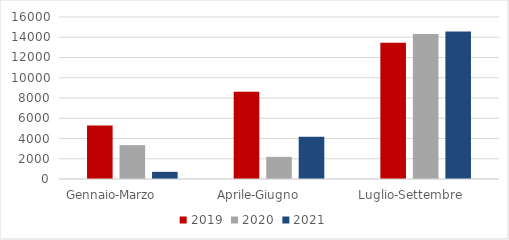
| Category | 2019 | 2020 | 2021 |
|---|---|---|---|
| Gennaio-Marzo           | 5292 | 3347 | 708 |
| Aprile-Giugno           | 8609 | 2187 | 4184 |
| Luglio-Settembre        | 13450 | 14328 | 14580 |